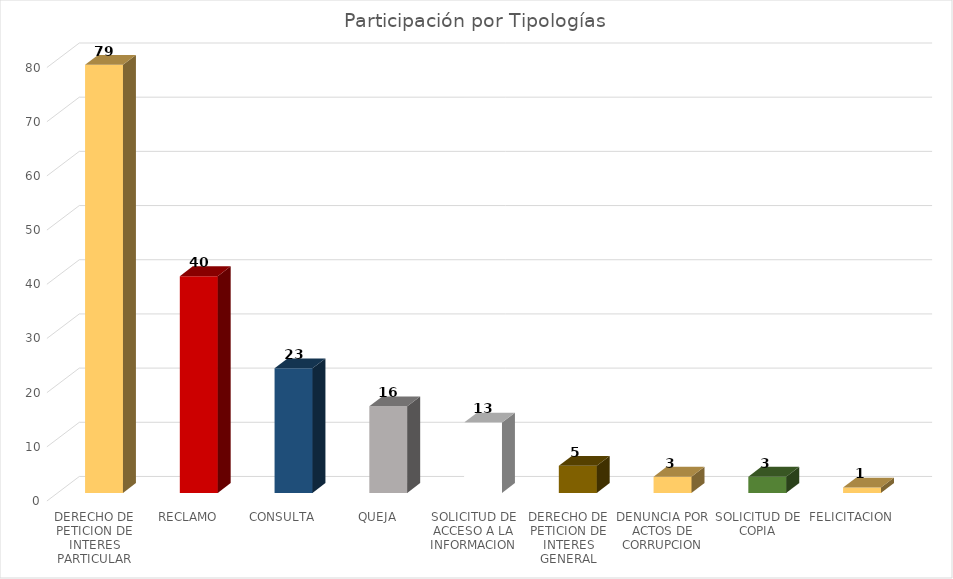
| Category | Total |
|---|---|
| DERECHO DE PETICION DE INTERES PARTICULAR | 79 |
| RECLAMO | 40 |
| CONSULTA | 23 |
| QUEJA | 16 |
| SOLICITUD DE ACCESO A LA INFORMACION | 13 |
| DERECHO DE PETICION DE INTERES GENERAL | 5 |
| DENUNCIA POR ACTOS DE CORRUPCION | 3 |
| SOLICITUD DE COPIA | 3 |
| FELICITACION | 1 |